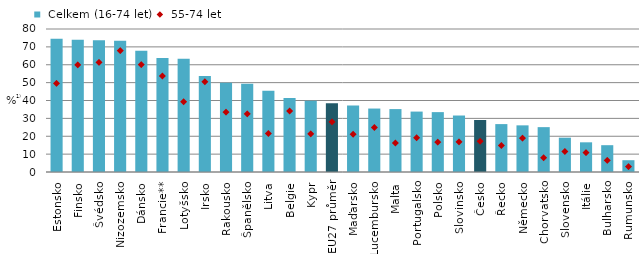
| Category |  Celkem (16-74 let) |
|---|---|
| Estonsko | 74.6 |
| Finsko | 74 |
| Švédsko | 73.7 |
| Nizozemsko | 73.4 |
| Dánsko | 67.8 |
| Francie** | 63.742 |
| Lotyšsko | 63.4 |
| Irsko | 53.7 |
| Rakousko | 49.9 |
| Španělsko | 49.4 |
| Litva | 45.4 |
| Belgie | 41.4 |
| Kypr | 39.9 |
| EU27 průměr | 38.458 |
| Maďarsko | 37.2 |
| Lucembursko | 35.5 |
| Malta | 35.2 |
| Portugalsko | 33.8 |
| Polsko | 33.5 |
| Slovinsko | 31.6 |
| Česko | 29.1 |
| Řecko | 26.8 |
| Německo | 26.1 |
| Chorvatsko | 25.1 |
| Slovensko | 19.2 |
| Itálie | 16.608 |
| Bulharsko | 15 |
| Rumunsko | 6.6 |